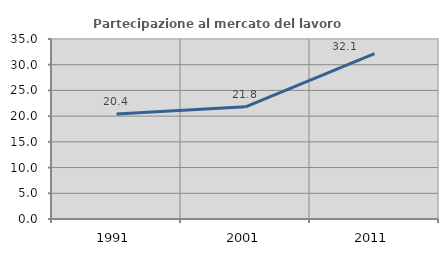
| Category | Partecipazione al mercato del lavoro  femminile |
|---|---|
| 1991.0 | 20.415 |
| 2001.0 | 21.818 |
| 2011.0 | 32.143 |